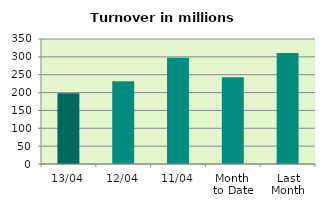
| Category | Series 0 |
|---|---|
| 13/04 | 197.911 |
| 12/04 | 231.85 |
| 11/04 | 297.827 |
| Month 
to Date | 242.983 |
| Last
Month | 310.688 |